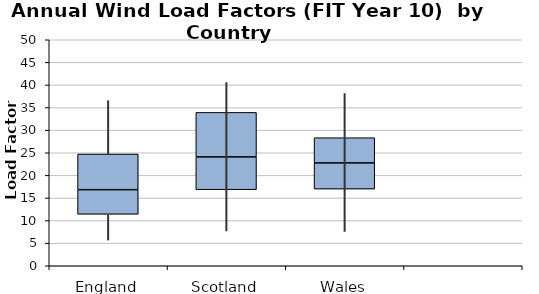
| Category | Series 0 | Series 1 | Series 2 |
|---|---|---|---|
| 0 | 11.39 | 5.44 | 7.89 |
| 1 | 16.83 | 7.26 | 9.84 |
| 2 | 16.96 | 5.8 | 5.57 |